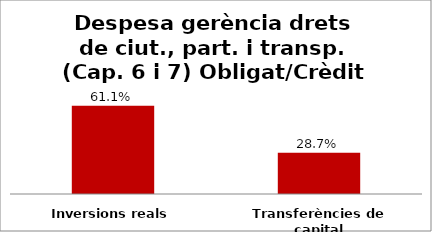
| Category | Series 0 |
|---|---|
| Inversions reals | 0.611 |
| Transferències de capital | 0.287 |